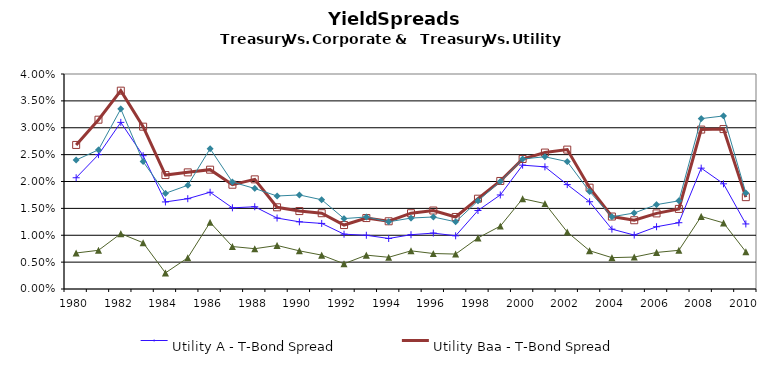
| Category | Utility A - T-Bond Spread | Utility Baa - T-Bond Spread | Corporate Aaa - T-Bond Spread | Corporate Baa - T-Bond Spread |
|---|---|---|---|---|
| 1980.0 | 0.021 | 0.027 | 0.007 | 0.024 |
| 1981.0 | 0.025 | 0.032 | 0.007 | 0.026 |
| 1982.0 | 0.031 | 0.037 | 0.01 | 0.034 |
| 1983.0 | 0.025 | 0.03 | 0.009 | 0.024 |
| 1984.0 | 0.016 | 0.021 | 0.003 | 0.018 |
| 1985.0 | 0.017 | 0.022 | 0.006 | 0.019 |
| 1986.0 | 0.018 | 0.022 | 0.012 | 0.026 |
| 1987.0 | 0.015 | 0.019 | 0.008 | 0.02 |
| 1988.0 | 0.015 | 0.02 | 0.007 | 0.019 |
| 1989.0 | 0.013 | 0.015 | 0.008 | 0.017 |
| 1990.0 | 0.012 | 0.014 | 0.007 | 0.018 |
| 1991.0 | 0.012 | 0.014 | 0.006 | 0.017 |
| 1992.0 | 0.01 | 0.012 | 0.005 | 0.013 |
| 1993.0 | 0.01 | 0.013 | 0.006 | 0.013 |
| 1994.0 | 0.009 | 0.013 | 0.006 | 0.012 |
| 1995.0 | 0.01 | 0.014 | 0.007 | 0.013 |
| 1996.0 | 0.01 | 0.015 | 0.007 | 0.013 |
| 1997.0 | 0.01 | 0.013 | 0.006 | 0.012 |
| 1998.0 | 0.015 | 0.017 | 0.009 | 0.016 |
| 1999.0 | 0.018 | 0.02 | 0.012 | 0.02 |
| 2000.0 | 0.023 | 0.024 | 0.017 | 0.024 |
| 2001.0 | 0.023 | 0.025 | 0.016 | 0.025 |
| 2002.0 | 0.019 | 0.026 | 0.011 | 0.024 |
| 2003.0 | 0.016 | 0.019 | 0.007 | 0.018 |
| 2004.0 | 0.011 | 0.013 | 0.006 | 0.013 |
| 2005.0 | 0.01 | 0.013 | 0.006 | 0.014 |
| 2006.0 | 0.012 | 0.014 | 0.007 | 0.016 |
| 2007.0 | 0.012 | 0.015 | 0.007 | 0.016 |
| 2008.0 | 0.022 | 0.03 | 0.013 | 0.032 |
| 2009.0 | 0.02 | 0.03 | 0.012 | 0.032 |
| 2010.0 | 0.012 | 0.017 | 0.007 | 0.018 |